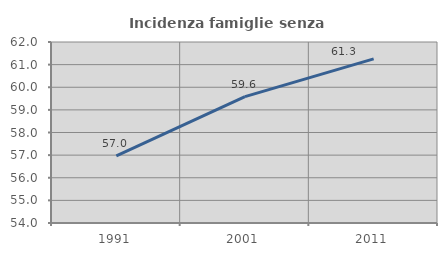
| Category | Incidenza famiglie senza nuclei |
|---|---|
| 1991.0 | 56.971 |
| 2001.0 | 59.586 |
| 2011.0 | 61.255 |